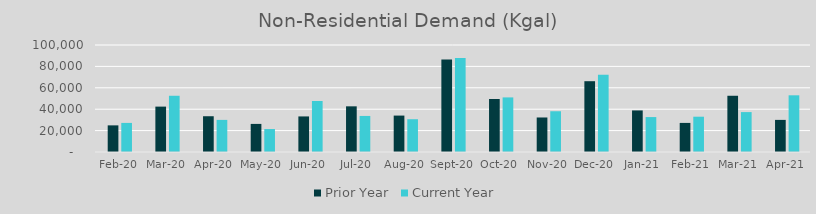
| Category | Prior Year | Current Year |
|---|---|---|
| 2020-02-01 | 24891.705 | 27184.287 |
| 2020-03-01 | 42416.796 | 52556.784 |
| 2020-04-01 | 33427.881 | 30008.586 |
| 2020-05-01 | 26254.448 | 21459.484 |
| 2020-06-01 | 33248.873 | 47687.401 |
| 2020-07-01 | 42679.938 | 33702.696 |
| 2020-08-01 | 34036.498 | 30630.765 |
| 2020-09-01 | 86367.775 | 87939.966 |
| 2020-10-01 | 49561.754 | 51017.647 |
| 2020-11-01 | 32261.42 | 38090.247 |
| 2020-12-01 | 66164.871 | 72201.815 |
| 2021-01-01 | 38851.995 | 32645.301 |
| 2021-02-01 | 27184.287 | 32987.653 |
| 2021-03-01 | 52556.784 | 37296.185 |
| 2021-04-01 | 30008.586 | 52983.593 |